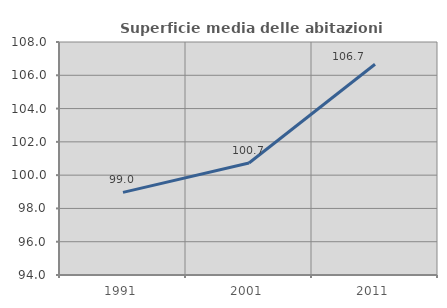
| Category | Superficie media delle abitazioni occupate |
|---|---|
| 1991.0 | 98.963 |
| 2001.0 | 100.727 |
| 2011.0 | 106.661 |